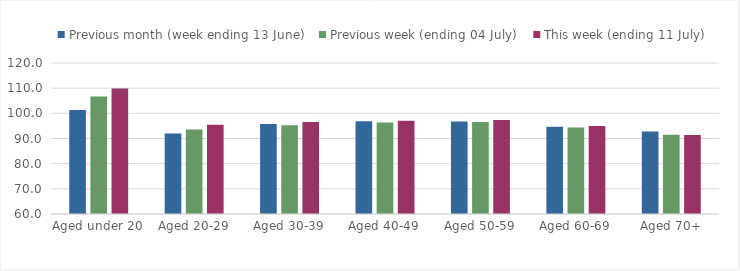
| Category | Previous month (week ending 13 June) | Previous week (ending 04 July) | This week (ending 11 July) |
|---|---|---|---|
| Aged under 20 | 101.323 | 106.645 | 109.912 |
| Aged 20-29 | 92.036 | 93.572 | 95.431 |
| Aged 30-39 | 95.756 | 95.216 | 96.531 |
| Aged 40-49 | 96.858 | 96.343 | 97.098 |
| Aged 50-59 | 96.707 | 96.596 | 97.364 |
| Aged 60-69 | 94.675 | 94.369 | 94.936 |
| Aged 70+ | 92.79 | 91.46 | 91.405 |